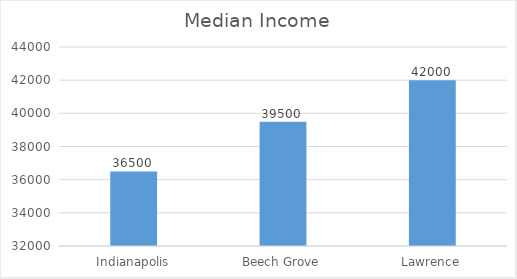
| Category | Median Income |
|---|---|
| Indianapolis | 36500 |
| Beech Grove | 39500 |
| Lawrence | 42000 |